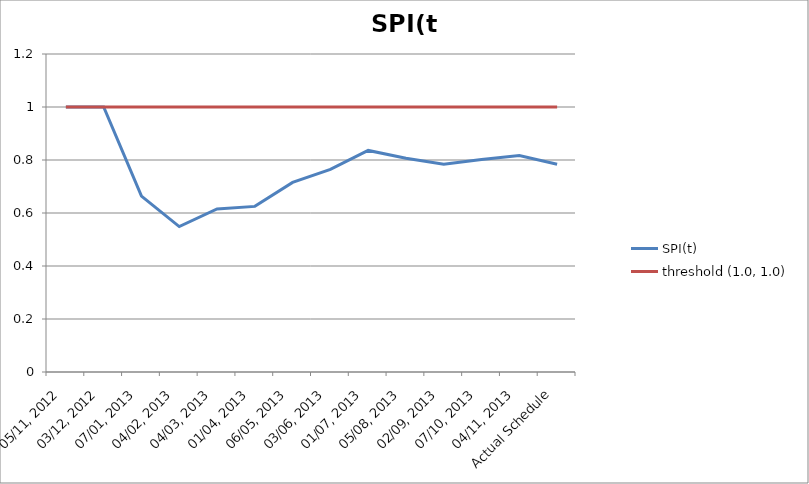
| Category | SPI(t) | threshold (1.0, 1.0) |
|---|---|---|
| 05/11, 2012 | 1 | 1 |
| 03/12, 2012 | 1 | 1 |
| 07/01, 2013 | 0.663 | 1 |
| 04/02, 2013 | 0.549 | 1 |
| 04/03, 2013 | 0.615 | 1 |
| 01/04, 2013 | 0.625 | 1 |
| 06/05, 2013 | 0.715 | 1 |
| 03/06, 2013 | 0.764 | 1 |
| 01/07, 2013 | 0.836 | 1 |
| 05/08, 2013 | 0.807 | 1 |
| 02/09, 2013 | 0.784 | 1 |
| 07/10, 2013 | 0.802 | 1 |
| 04/11, 2013 | 0.816 | 1 |
| Actual Schedule | 0.784 | 1 |